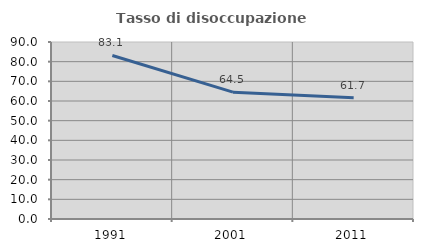
| Category | Tasso di disoccupazione giovanile  |
|---|---|
| 1991.0 | 83.144 |
| 2001.0 | 64.487 |
| 2011.0 | 61.668 |